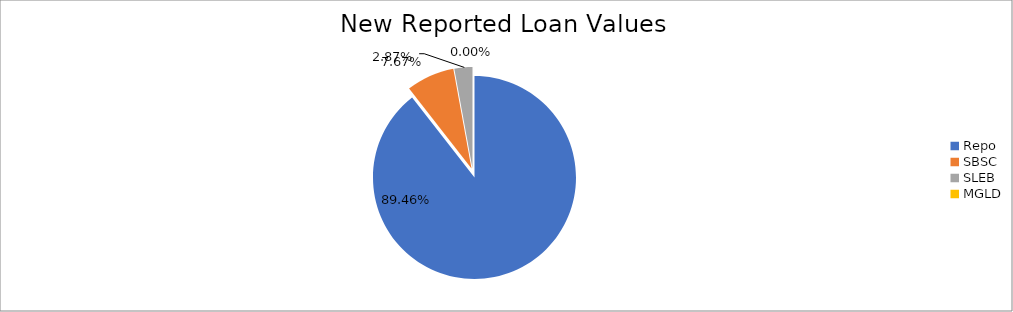
| Category | Series 0 |
|---|---|
| Repo | 10322325.298 |
| SBSC | 885006.317 |
| SLEB | 331031.292 |
| MGLD | 85.29 |